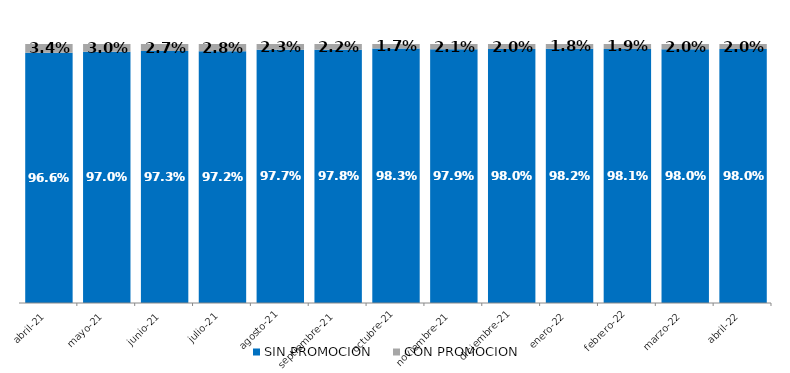
| Category | SIN PROMOCION   | CON PROMOCION   |
|---|---|---|
| 2021-04-01 | 0.966 | 0.034 |
| 2021-05-01 | 0.97 | 0.03 |
| 2021-06-01 | 0.973 | 0.027 |
| 2021-07-01 | 0.972 | 0.028 |
| 2021-08-01 | 0.977 | 0.023 |
| 2021-09-01 | 0.978 | 0.022 |
| 2021-10-01 | 0.983 | 0.017 |
| 2021-11-01 | 0.979 | 0.021 |
| 2021-12-01 | 0.98 | 0.02 |
| 2022-01-01 | 0.982 | 0.018 |
| 2022-02-01 | 0.981 | 0.019 |
| 2022-03-01 | 0.98 | 0.02 |
| 2022-04-01 | 0.98 | 0.02 |